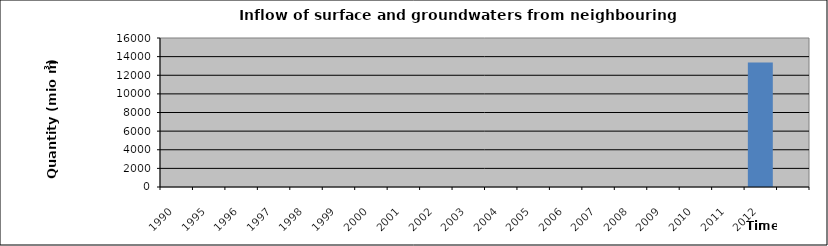
| Category | 1990 1995 1996 1997 1998 1999 2000 2001 2002 2003 2004 2005 2006 2007 2008 2009 2010 2011 2012 |
|---|---|
| 1990.0 | 0 |
| 1995.0 | 0 |
| 1996.0 | 0 |
| 1997.0 | 0 |
| 1998.0 | 0 |
| 1999.0 | 0 |
| 2000.0 | 0 |
| 2001.0 | 0 |
| 2002.0 | 0 |
| 2003.0 | 0 |
| 2004.0 | 0 |
| 2005.0 | 0 |
| 2006.0 | 0 |
| 2007.0 | 0 |
| 2008.0 | 0 |
| 2009.0 | 0 |
| 2010.0 | 0 |
| 2011.0 | 0 |
| 2012.0 | 13372 |